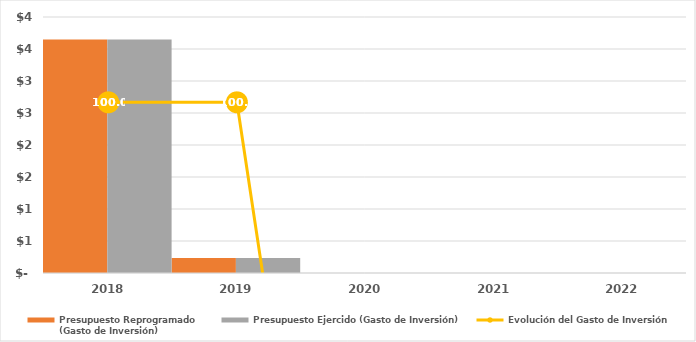
| Category | Presupuesto Reprogramado
(Gasto de Inversión) | Presupuesto Ejercido (Gasto de Inversión) |
|---|---|---|
| 2018.0 | 3647.025 | 3647.025 |
| 2019.0 | 234.45 | 234.45 |
| 2020.0 | 0 | 0 |
| 2021.0 | 0 | 0 |
| 2022.0 | 0 | 0 |